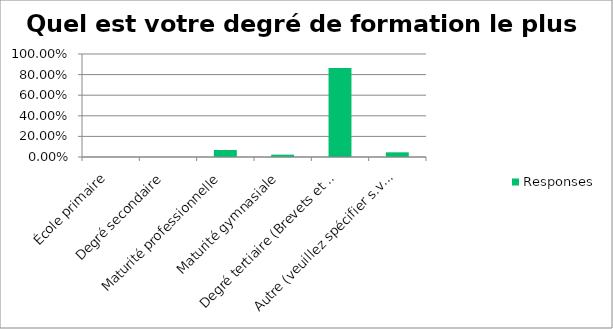
| Category | Responses |
|---|---|
| École primaire | 0 |
| Degré secondaire | 0 |
| Maturité professionnelle | 0.068 |
| Maturité gymnasiale | 0.023 |
| Degré tertiaire (Brevets et diplômes fédéraux, Formation professionnelle supérieure, Écoles supérieures, Hautes écoles, Hautes écoles universitaires) | 0.864 |
| Autre (veuillez spécifier s.v.p.) | 0.046 |